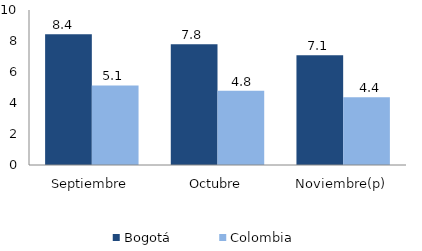
| Category | Bogotá | Colombia |
|---|---|---|
| Septiembre | 8.441 | 5.132 |
| Octubre | 7.795 | 4.792 |
| Noviembre(p) | 7.073 | 4.365 |